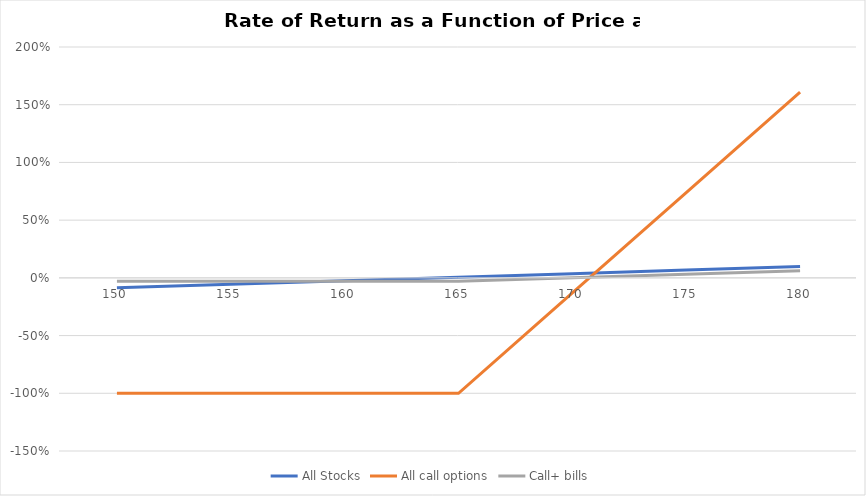
| Category | All Stocks | All call options | Call+ bills |
|---|---|---|---|
| 150.0 | -0.085 | -1 | -0.03 |
| 155.0 | -0.055 | -1 | -0.03 |
| 160.0 | -0.024 | -1 | -0.03 |
| 165.0 | 0.006 | -1 | -0.03 |
| 170.0 | 0.037 | -0.13 | 0 |
| 175.0 | 0.067 | 0.739 | 0.031 |
| 180.0 | 0.098 | 1.609 | 0.061 |